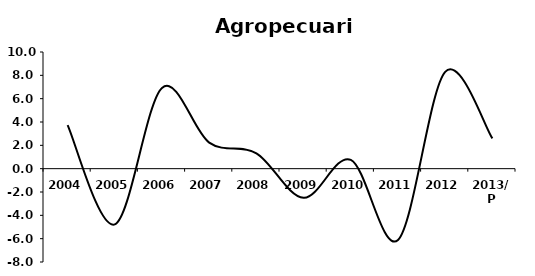
| Category | Agricultura, cría y explotación de animales, aprovechamiento forestal, pesca y caza |
|---|---|
| 2004 | 3.736 |
| 2005 | -4.78 |
| 2006 | 6.92 |
| 2007 | 2.238 |
| 2008 | 1.315 |
| 2009 | -2.5 |
| 2010 | 0.756 |
| 2011 | -6.106 |
| 2012 | 8.3 |
| 2013/P | 2.6 |